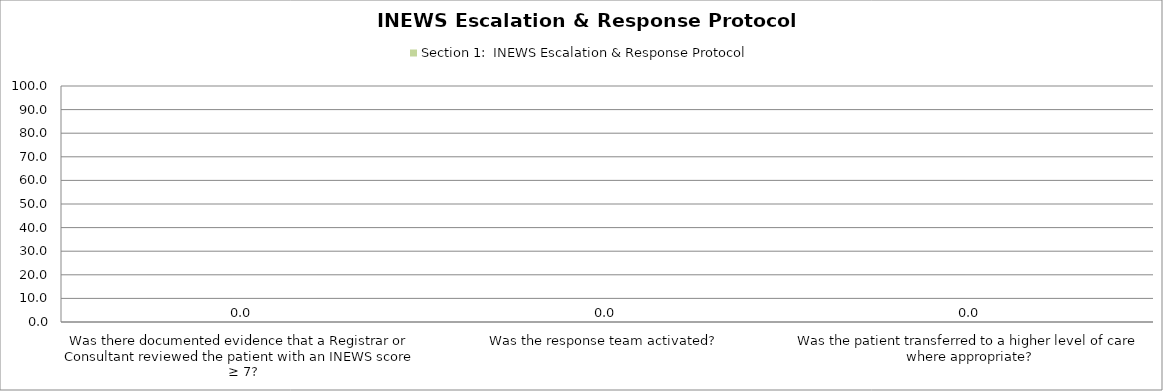
| Category | Section 1:  INEWS Escalation & Response Protocol |
|---|---|
| Was there documented evidence that a Registrar or Consultant reviewed the patient with an INEWS score ≥ 7? | 0 |
| Was the response team activated? | 0 |
| Was the patient transferred to a higher level of care where appropriate? | 0 |